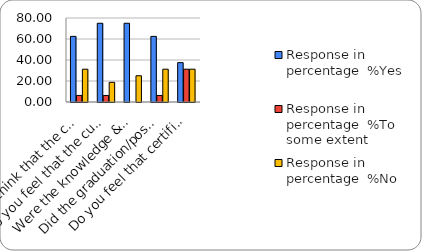
| Category | Response in percentage  |
|---|---|
| Do you think that the curriculum which you had during your graduation/post graduation has provided you with the knowledge & skills necessary to get employed/Self-employed or start own business? | 31.25 |
| Do you feel that the curriculum you studied is helpful in progression to higher studies? | 18.75 |
| Were the knowledge & skills acquired through the curriculum useful to you while working on the job?   | 25 |
| Did the graduation/post-graduation programme bring about any attitudinal and behavioural change in you? | 31.25 |
| Do you feel that certificate/ diploma courses offered by the college in addition to the curriculum lead to better career prospects? | 31.25 |